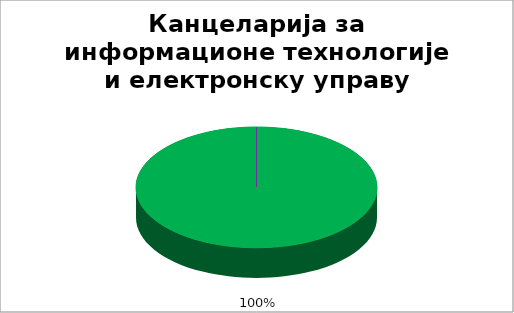
| Category | Канцеларија за информационе технологије и електронску управу |
|---|---|
| 0 | 1 |
| 1 | 0 |
| 2 | 0 |
| 3 | 0 |
| 4 | 0 |